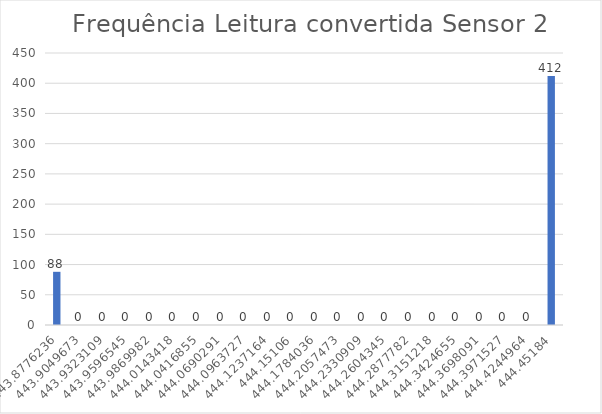
| Category | Series 0 |
|---|---|
| 443.87762363636364 | 88 |
| 443.9049672727273 | 0 |
| 443.9323109090909 | 0 |
| 443.95965454545455 | 0 |
| 443.9869981818182 | 0 |
| 444.01434181818183 | 0 |
| 444.0416854545455 | 0 |
| 444.0690290909091 | 0 |
| 444.09637272727275 | 0 |
| 444.1237163636364 | 0 |
| 444.15106000000003 | 0 |
| 444.1784036363636 | 0 |
| 444.20574727272725 | 0 |
| 444.2330909090909 | 0 |
| 444.26043454545453 | 0 |
| 444.28777818181817 | 0 |
| 444.3151218181818 | 0 |
| 444.34246545454545 | 0 |
| 444.3698090909091 | 0 |
| 444.3971527272727 | 0 |
| 444.42449636363637 | 0 |
| 444.45184 | 412 |